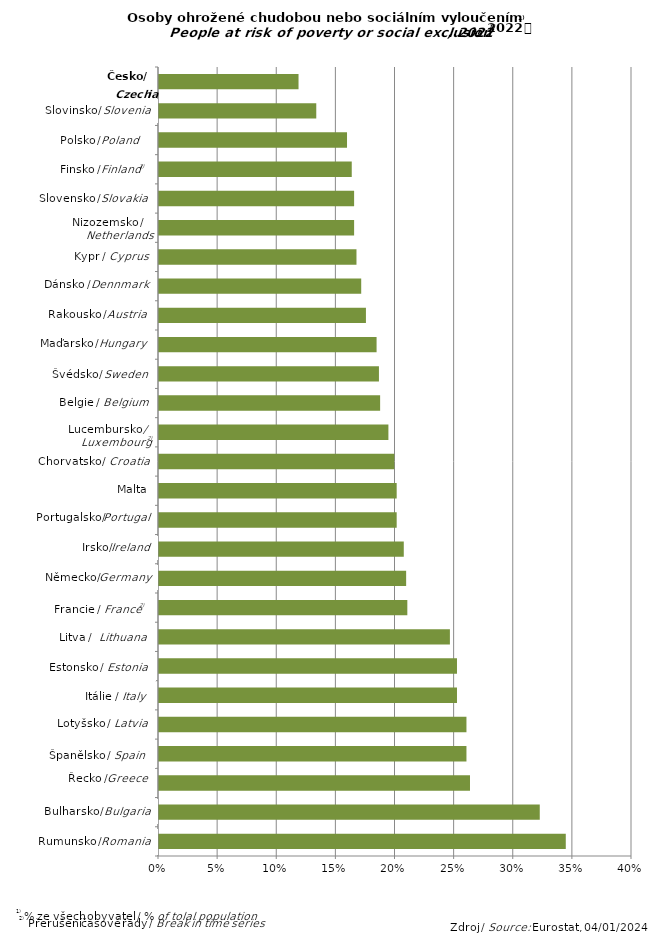
| Category | Series 0 |
|---|---|
| Romania | 0.344 |
| Bulgaria | 0.322 |
| Greece | 0.263 |
| Spain | 0.26 |
| Latvia | 0.26 |
| Italy | 0.252 |
| Estonia | 0.252 |
| Lithuania | 0.246 |
| France | 0.21 |
| Germany | 0.209 |
| Ireland | 0.207 |
| Portugal | 0.201 |
| Malta | 0.201 |
| Croatia | 0.199 |
| Luxembourg | 0.194 |
| Belgium | 0.187 |
| Sweden | 0.186 |
| Hungary | 0.184 |
| Austria | 0.175 |
| Denmark | 0.171 |
| Cyprus | 0.167 |
| Netherlands | 0.165 |
| Slovakia | 0.165 |
| Finland | 0.163 |
| Poland | 0.159 |
| Slovenia | 0.133 |
| Czechia | 0.118 |